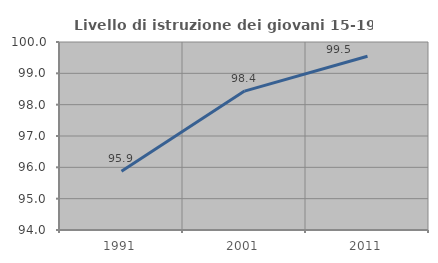
| Category | Livello di istruzione dei giovani 15-19 anni |
|---|---|
| 1991.0 | 95.879 |
| 2001.0 | 98.433 |
| 2011.0 | 99.545 |